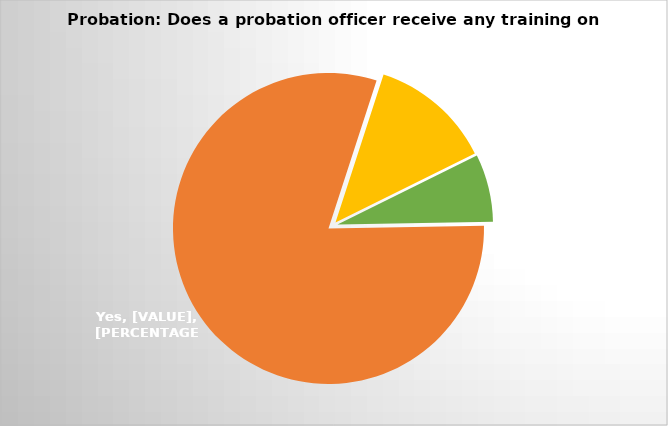
| Category | Series 1 | Series 0 |
|---|---|---|
| 0 | 57 | 48 |
| 1 | 9 | 183 |
| 2 | 5 | 6 |